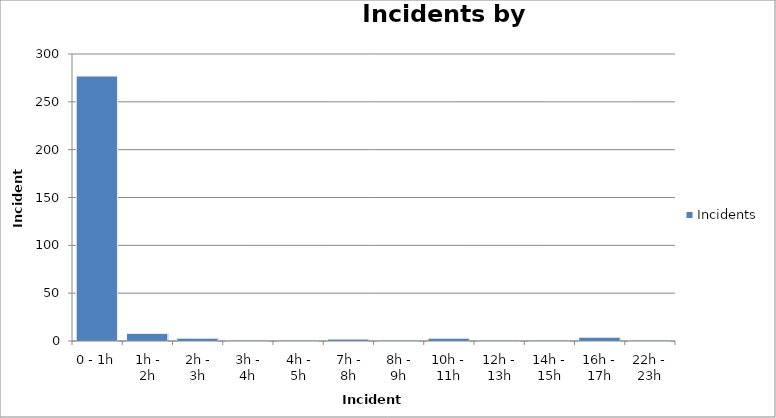
| Category | Incidents |
|---|---|
| 0 - 1h | 277 |
| 1h - 2h | 8 |
| 2h - 3h | 3 |
| 3h - 4h | 1 |
| 4h - 5h | 1 |
| 7h - 8h | 2 |
| 8h - 9h | 1 |
| 10h - 11h | 3 |
| 12h - 13h | 1 |
| 14h - 15h | 1 |
| 16h - 17h | 4 |
| 22h - 23h | 1 |